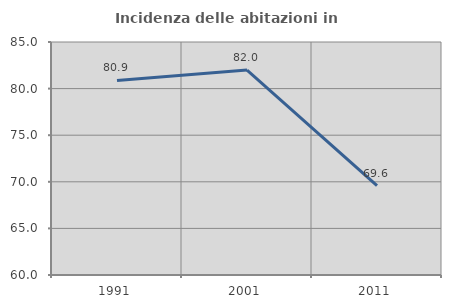
| Category | Incidenza delle abitazioni in proprietà  |
|---|---|
| 1991.0 | 80.876 |
| 2001.0 | 81.994 |
| 2011.0 | 69.592 |